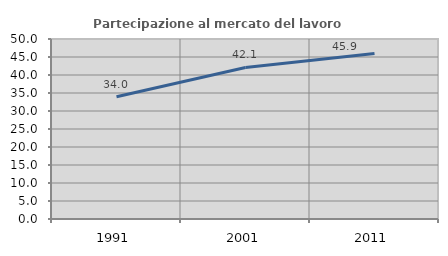
| Category | Partecipazione al mercato del lavoro  femminile |
|---|---|
| 1991.0 | 33.967 |
| 2001.0 | 42.105 |
| 2011.0 | 45.946 |